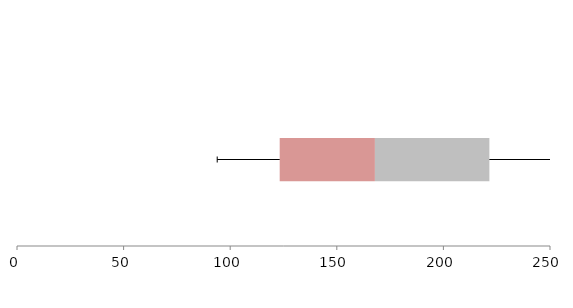
| Category | Series 1 | Series 2 | Series 3 |
|---|---|---|---|
| 0 | 123.218 | 44.661 | 53.694 |